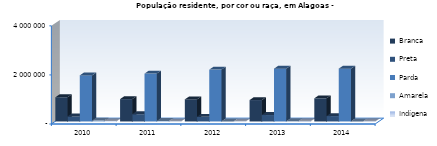
| Category | Branca                                                                           | Preta                                                                            | Parda                                                                            | Amarela                                                                          | Indígena                                                                         |
|---|---|---|---|---|---|
| 2010.0 | 986326 | 205154 | 1877818 | 36684 | 14509 |
| 2011.0 | 912030 | 295764 | 1951143 | 20718 | 4604 |
| 2012.0 | 898842 | 189552 | 2112615 | 2355 | 4120 |
| 2013.0 | 872276 | 262124 | 2151423 | 8475 | 11502 |
| 2014.0 | 943529 | 220190 | 2152108 | 2393 | 7780 |